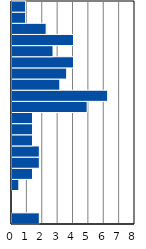
| Category | Series 0 |
|---|---|
| 0-4 | 1.778 |
| 5-9 | 0 |
| 10-14 | 0 |
| 15-19 | 0.444 |
| 20-24 | 1.333 |
| 25-29 | 1.778 |
| 30-34 | 1.778 |
| 35-39 | 1.333 |
| 40-44 | 1.333 |
| 45-49 | 1.333 |
| 50-54 | 4.889 |
| 55-59 | 6.222 |
| 60-64 | 3.111 |
| 65-69 | 3.556 |
| 70-74 | 4 |
| 75-79 | 2.667 |
| 80-84 | 4 |
| 85-89 | 2.222 |
| 90-94 | 0.889 |
| 95+ | 0.889 |